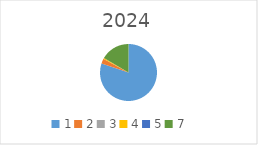
| Category | Series 0 |
|---|---|
| 1.0 | 9717553 |
| 2.0 | 342250 |
| 3.0 | 0 |
| 4.0 | 67105 |
| 5.0 | 0 |
| 7.0 | 2001000 |